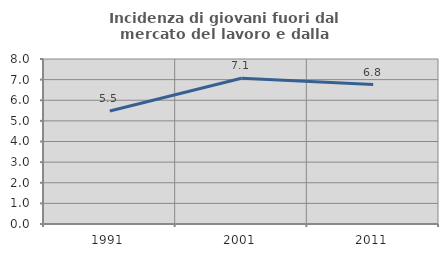
| Category | Incidenza di giovani fuori dal mercato del lavoro e dalla formazione  |
|---|---|
| 1991.0 | 5.479 |
| 2001.0 | 7.064 |
| 2011.0 | 6.761 |